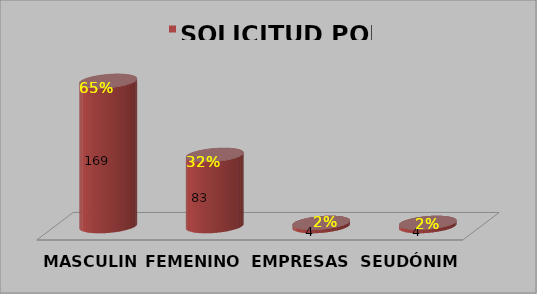
| Category | SOLICITUD POR GÉNERO |
|---|---|
| MASCULINO | 0.65 |
| FEMENINO | 0.319 |
| EMPRESAS | 0.015 |
| SEUDÓNIMO | 0.015 |